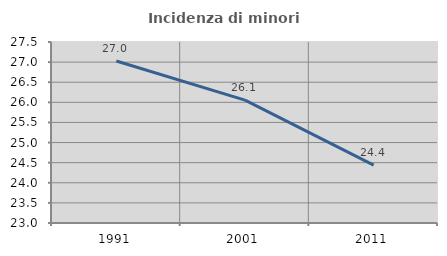
| Category | Incidenza di minori stranieri |
|---|---|
| 1991.0 | 27.027 |
| 2001.0 | 26.056 |
| 2011.0 | 24.439 |